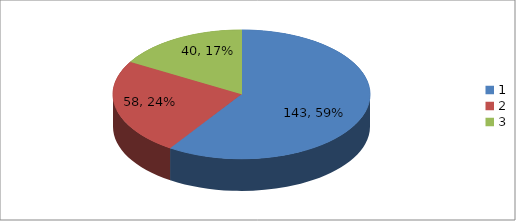
| Category | Series 0 |
|---|---|
| 0 | 143 |
| 1 | 58 |
| 2 | 40 |